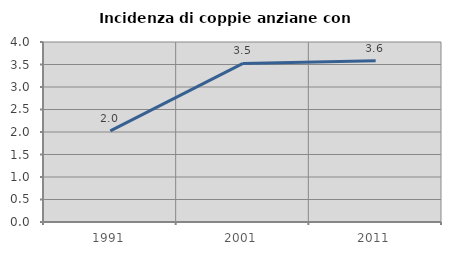
| Category | Incidenza di coppie anziane con figli |
|---|---|
| 1991.0 | 2.024 |
| 2001.0 | 3.524 |
| 2011.0 | 3.582 |